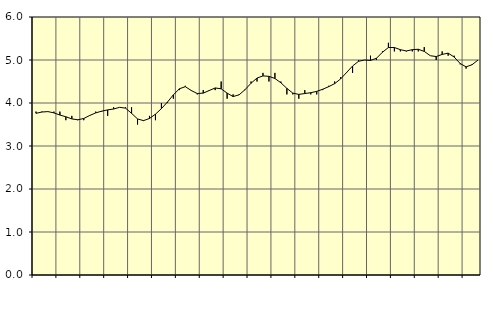
| Category | Piggar | Series 1 |
|---|---|---|
| nan | 3.8 | 3.76 |
| 1.0 | 3.8 | 3.79 |
| 1.0 | 3.8 | 3.8 |
| 1.0 | 3.8 | 3.77 |
| nan | 3.8 | 3.72 |
| 2.0 | 3.6 | 3.68 |
| 2.0 | 3.7 | 3.63 |
| 2.0 | 3.6 | 3.61 |
| nan | 3.6 | 3.64 |
| 3.0 | 3.7 | 3.71 |
| 3.0 | 3.8 | 3.77 |
| 3.0 | 3.8 | 3.81 |
| nan | 3.7 | 3.84 |
| 4.0 | 3.9 | 3.86 |
| 4.0 | 3.9 | 3.9 |
| 4.0 | 3.9 | 3.88 |
| nan | 3.9 | 3.76 |
| 5.0 | 3.5 | 3.63 |
| 5.0 | 3.6 | 3.59 |
| 5.0 | 3.7 | 3.64 |
| nan | 3.6 | 3.74 |
| 6.0 | 4 | 3.87 |
| 6.0 | 4 | 4.02 |
| 6.0 | 4.1 | 4.19 |
| nan | 4.3 | 4.33 |
| 7.0 | 4.4 | 4.38 |
| 7.0 | 4.3 | 4.29 |
| 7.0 | 4.2 | 4.22 |
| nan | 4.3 | 4.23 |
| 8.0 | 4.3 | 4.29 |
| 8.0 | 4.3 | 4.35 |
| 8.0 | 4.5 | 4.33 |
| nan | 4.1 | 4.23 |
| 9.0 | 4.2 | 4.15 |
| 9.0 | 4.2 | 4.19 |
| 9.0 | 4.3 | 4.31 |
| nan | 4.5 | 4.46 |
| 10.0 | 4.5 | 4.58 |
| 10.0 | 4.7 | 4.63 |
| 10.0 | 4.5 | 4.62 |
| nan | 4.7 | 4.57 |
| 11.0 | 4.5 | 4.47 |
| 11.0 | 4.2 | 4.34 |
| 11.0 | 4.2 | 4.23 |
| nan | 4.1 | 4.2 |
| 12.0 | 4.3 | 4.22 |
| 12.0 | 4.2 | 4.24 |
| 12.0 | 4.2 | 4.27 |
| nan | 4.3 | 4.32 |
| 13.0 | 4.4 | 4.38 |
| 13.0 | 4.5 | 4.45 |
| 13.0 | 4.6 | 4.56 |
| nan | 4.7 | 4.71 |
| 14.0 | 4.7 | 4.86 |
| 14.0 | 5 | 4.97 |
| 14.0 | 5 | 5 |
| nan | 5.1 | 4.99 |
| 15.0 | 5 | 5.04 |
| 15.0 | 5.2 | 5.18 |
| 15.0 | 5.4 | 5.29 |
| nan | 5.2 | 5.29 |
| 16.0 | 5.2 | 5.24 |
| 16.0 | 5.2 | 5.21 |
| 16.0 | 5.2 | 5.24 |
| nan | 5.2 | 5.25 |
| 17.0 | 5.3 | 5.2 |
| 17.0 | 5.1 | 5.1 |
| 17.0 | 5 | 5.08 |
| nan | 5.2 | 5.13 |
| 18.0 | 5.1 | 5.16 |
| 18.0 | 5.1 | 5.07 |
| 18.0 | 4.9 | 4.92 |
| nan | 4.8 | 4.84 |
| 19.0 | 4.9 | 4.89 |
| 19.0 | 5 | 5 |